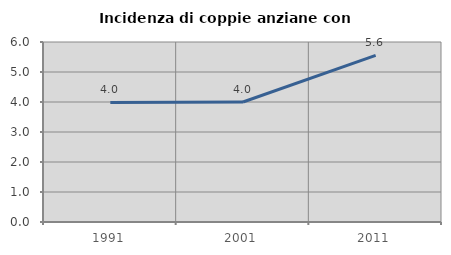
| Category | Incidenza di coppie anziane con figli |
|---|---|
| 1991.0 | 3.984 |
| 2001.0 | 4 |
| 2011.0 | 5.556 |